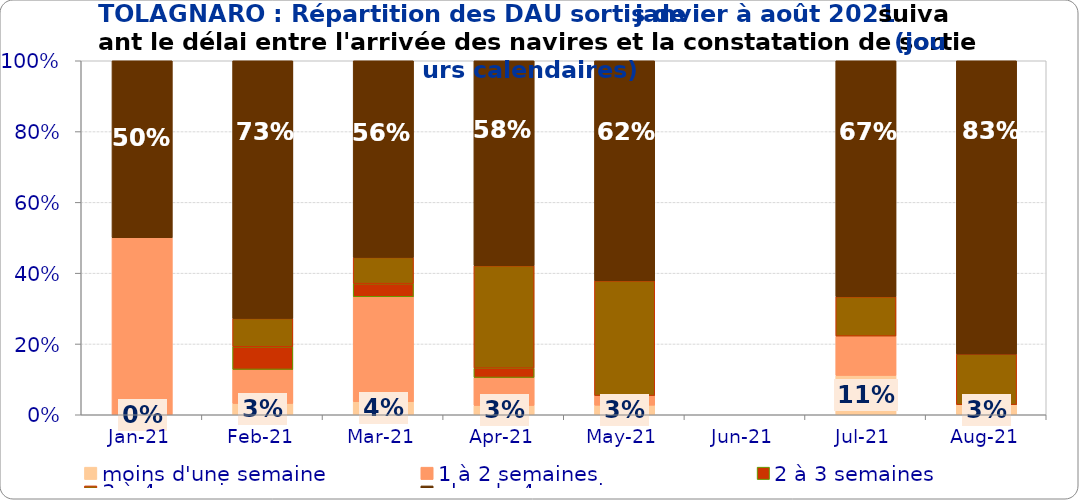
| Category | moins d'une semaine | 1 à 2 semaines | 2 à 3 semaines | 3 à 4 semaines | plus de 4 semaines |
|---|---|---|---|---|---|
| 2021-01-01 | 0 | 0.5 | 0 | 0 | 0.5 |
| 2021-02-01 | 0.032 | 0.096 | 0.064 | 0.08 | 0.728 |
| 2021-03-01 | 0.037 | 0.296 | 0.037 | 0.074 | 0.556 |
| 2021-04-01 | 0.026 | 0.079 | 0.026 | 0.289 | 0.579 |
| 2021-05-01 | 0.027 | 0.027 | 0 | 0.324 | 0.622 |
| 2021-06-01 | 0 | 0 | 0 | 0 | 0 |
| 2021-07-01 | 0.111 | 0.111 | 0 | 0.111 | 0.667 |
| 2021-08-01 | 0.029 | 0 | 0 | 0.143 | 0.829 |